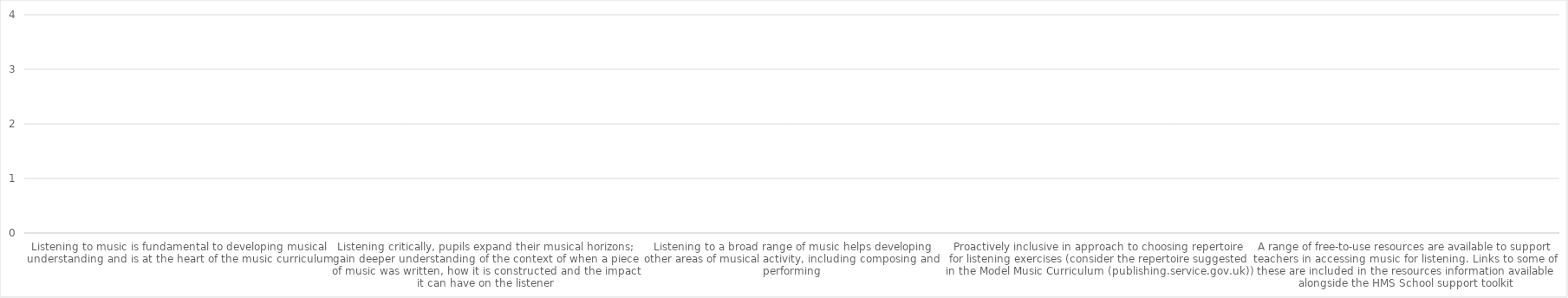
| Category | Series 0 |
|---|---|
| Listening to music is fundamental to developing musical understanding and is at the heart of the music curriculum | 0 |
| Listening critically, pupils expand their musical horizons; gain deeper understanding of the context of when a piece of music was written, how it is constructed and the impact it can have on the listener | 0 |
| Listening to a broad range of music helps developing other areas of musical activity, including composing and performing | 0 |
| Proactively inclusive in approach to choosing repertoire for listening exercises (consider the repertoire suggested in the Model Music Curriculum (publishing.service.gov.uk)) | 0 |
| A range of free-to-use resources are available to support teachers in accessing music for listening. Links to some of these are included in the resources information available alongside the HMS School support toolkit | 0 |